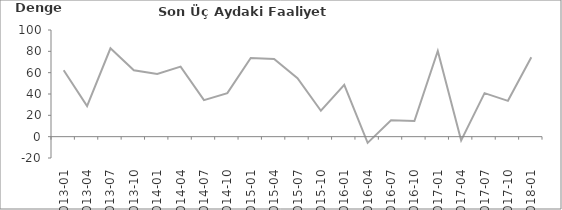
| Category | Son Üç Aydaki Faaliyet Giderleri |
|---|---|
| 2013-01 | 62.3 |
| 2013-04 | 28.6 |
| 2013-07 | 82.8 |
| 2013-10 | 62.3 |
| 2014-01 | 58.7 |
| 2014-04 | 65.7 |
| 2014-07 | 34.2 |
| 2014-10 | 40.8 |
| 2015-01 | 73.7 |
| 2015-04 | 72.9 |
| 2015-07 | 54.8 |
| 2015-10 | 24.3 |
| 2016-01 | 48.5 |
| 2016-04 | -5.8 |
| 2016-07 | 15.4 |
| 2016-10 | 14.6 |
| 2017-01 | 80.4 |
| 2017-04 | -3.6 |
| 2017-07 | 40.8 |
| 2017-10 | 33.6 |
| 2018-01 | 74.5 |